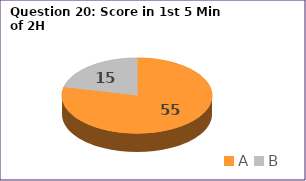
| Category | Series 0 |
|---|---|
| A | 55 |
| B | 15 |